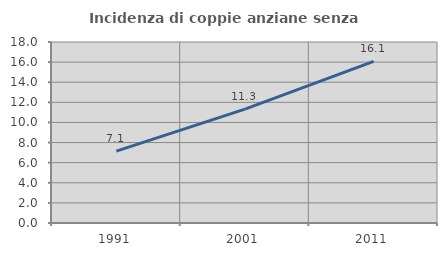
| Category | Incidenza di coppie anziane senza figli  |
|---|---|
| 1991.0 | 7.143 |
| 2001.0 | 11.321 |
| 2011.0 | 16.071 |